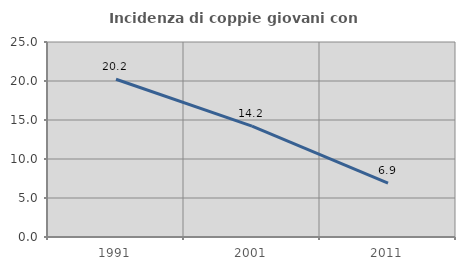
| Category | Incidenza di coppie giovani con figli |
|---|---|
| 1991.0 | 20.226 |
| 2001.0 | 14.211 |
| 2011.0 | 6.916 |